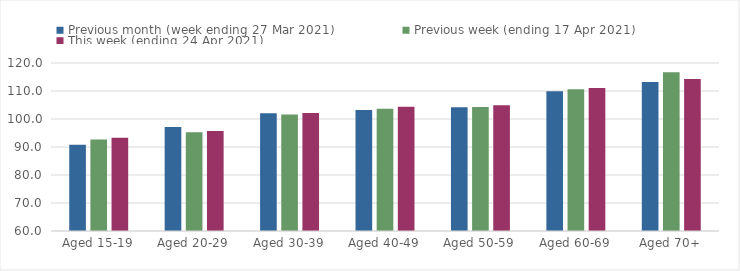
| Category | Previous month (week ending 27 Mar 2021) | Previous week (ending 17 Apr 2021) | This week (ending 24 Apr 2021) |
|---|---|---|---|
| Aged 15-19 | 90.76 | 92.72 | 93.28 |
| Aged 20-29 | 97.17 | 95.27 | 95.67 |
| Aged 30-39 | 102.09 | 101.62 | 102.1 |
| Aged 40-49 | 103.25 | 103.7 | 104.39 |
| Aged 50-59 | 104.2 | 104.31 | 104.91 |
| Aged 60-69 | 109.92 | 110.63 | 111.11 |
| Aged 70+ | 113.17 | 116.66 | 114.25 |